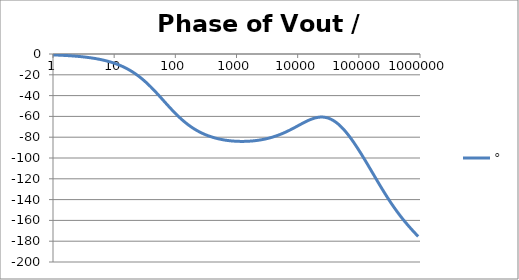
| Category | ° |
|---|---|
| 1.0 | -0.89 |
| 1.0715193052376064 | -0.954 |
| 1.1481536214968828 | -1.022 |
| 1.2302687708123814 | -1.095 |
| 1.318256738556407 | -1.174 |
| 1.4125375446227544 | -1.258 |
| 1.513561248436208 | -1.348 |
| 1.6218100973589298 | -1.444 |
| 1.7378008287493754 | -1.547 |
| 1.8620871366628673 | -1.658 |
| 1.9952623149688797 | -1.776 |
| 2.1379620895022318 | -1.903 |
| 2.2908676527677727 | -2.039 |
| 2.45470891568503 | -2.185 |
| 2.6302679918953817 | -2.341 |
| 2.8183829312644537 | -2.508 |
| 3.0199517204020156 | -2.687 |
| 3.235936569296282 | -2.879 |
| 3.467368504525316 | -3.085 |
| 3.7153522909717256 | -3.305 |
| 3.9810717055349727 | -3.541 |
| 4.265795188015926 | -3.793 |
| 4.570881896148749 | -4.064 |
| 4.897788193684462 | -4.353 |
| 5.2480746024977245 | -4.663 |
| 5.62341325190349 | -4.995 |
| 6.025595860743575 | -5.35 |
| 6.456542290346554 | -5.73 |
| 6.918309709189363 | -6.137 |
| 7.4131024130091765 | -6.572 |
| 7.943282347242814 | -7.038 |
| 8.511380382023765 | -7.536 |
| 9.120108393559095 | -8.068 |
| 9.772372209558105 | -8.636 |
| 10.47128548050899 | -9.243 |
| 11.22018454301963 | -9.892 |
| 12.022644346174127 | -10.584 |
| 12.88249551693134 | -11.321 |
| 13.803842646028851 | -12.108 |
| 14.791083881682074 | -12.945 |
| 15.848931924611136 | -13.836 |
| 16.98243652461744 | -14.784 |
| 18.197008586099834 | -15.789 |
| 19.498445997580447 | -16.856 |
| 20.892961308540382 | -17.986 |
| 22.387211385683386 | -19.18 |
| 23.988329190194897 | -20.441 |
| 25.703957827688622 | -21.769 |
| 27.54228703338165 | -23.165 |
| 29.51209226666385 | -24.629 |
| 31.62277660168379 | -26.16 |
| 33.884415613920254 | -27.756 |
| 36.307805477010106 | -29.416 |
| 38.90451449942804 | -31.136 |
| 41.686938347033525 | -32.911 |
| 44.6683592150963 | -34.736 |
| 47.86300923226381 | -36.605 |
| 51.28613839913647 | -38.511 |
| 54.95408738576247 | -40.446 |
| 58.88436553555889 | -42.401 |
| 63.09573444801931 | -44.366 |
| 67.60829753919813 | -46.334 |
| 72.44359600749901 | -48.293 |
| 77.62471166286915 | -50.235 |
| 83.17637711026705 | -52.151 |
| 89.12509381337456 | -54.033 |
| 95.49925860214357 | -55.872 |
| 102.32929922807544 | -57.663 |
| 109.64781961431841 | -59.399 |
| 117.48975549395293 | -61.075 |
| 125.89254117941665 | -62.688 |
| 134.89628825916537 | -64.235 |
| 144.54397707459273 | -65.713 |
| 154.88166189124806 | -67.122 |
| 165.95869074375608 | -68.46 |
| 177.82794100389225 | -69.729 |
| 190.5460717963248 | -70.928 |
| 204.17379446695278 | -72.059 |
| 218.77616239495524 | -73.124 |
| 234.42288153199212 | -74.124 |
| 251.18864315095806 | -75.062 |
| 269.15348039269156 | -75.939 |
| 288.4031503126605 | -76.758 |
| 309.0295432513591 | -77.521 |
| 331.1311214825911 | -78.231 |
| 354.81338923357566 | -78.89 |
| 380.18939632056095 | -79.499 |
| 407.3802778041123 | -80.062 |
| 436.5158322401654 | -80.58 |
| 467.7351412871979 | -81.056 |
| 501.18723362727184 | -81.49 |
| 537.0317963702526 | -81.886 |
| 575.4399373371566 | -82.244 |
| 616.5950018614822 | -82.565 |
| 660.6934480075952 | -82.853 |
| 707.9457843841375 | -83.107 |
| 758.5775750291831 | -83.328 |
| 812.8305161640983 | -83.519 |
| 870.9635899560801 | -83.678 |
| 933.2543007969903 | -83.808 |
| 999.9999999999998 | -83.909 |
| 1071.5193052376057 | -83.981 |
| 1148.1536214968828 | -84.025 |
| 1230.2687708123801 | -84.041 |
| 1318.2567385564053 | -84.028 |
| 1412.537544622753 | -83.988 |
| 1513.5612484362066 | -83.919 |
| 1621.8100973589292 | -83.823 |
| 1737.8008287493742 | -83.697 |
| 1862.0871366628671 | -83.542 |
| 1995.2623149688786 | -83.358 |
| 2137.9620895022326 | -83.143 |
| 2290.867652767771 | -82.897 |
| 2454.708915685027 | -82.62 |
| 2630.26799189538 | -82.31 |
| 2818.382931264451 | -81.966 |
| 3019.9517204020176 | -81.587 |
| 3235.9365692962774 | -81.173 |
| 3467.368504525316 | -80.723 |
| 3715.352290971724 | -80.235 |
| 3981.07170553497 | -79.709 |
| 4265.795188015923 | -79.144 |
| 4570.881896148745 | -78.539 |
| 4897.788193684463 | -77.894 |
| 5248.074602497726 | -77.209 |
| 5623.413251903489 | -76.485 |
| 6025.595860743574 | -75.721 |
| 6456.54229034655 | -74.92 |
| 6918.309709189357 | -74.084 |
| 7413.102413009165 | -73.214 |
| 7943.282347242815 | -72.316 |
| 8511.380382023763 | -71.392 |
| 9120.108393559092 | -70.449 |
| 9772.3722095581 | -69.493 |
| 10471.285480509003 | -68.533 |
| 11220.184543019639 | -67.576 |
| 12022.64434617411 | -66.633 |
| 12882.495516931338 | -65.715 |
| 13803.842646028841 | -64.834 |
| 14791.083881682063 | -64.001 |
| 15848.931924611119 | -63.231 |
| 16982.436524617453 | -62.536 |
| 18197.008586099837 | -61.93 |
| 19498.445997580417 | -61.426 |
| 20892.961308540387 | -61.037 |
| 22387.211385683382 | -60.773 |
| 23988.32919019488 | -60.646 |
| 25703.957827688606 | -60.666 |
| 27542.28703338167 | -60.84 |
| 29512.092266663854 | -61.175 |
| 31622.77660168378 | -61.677 |
| 33884.41561392023 | -62.348 |
| 36307.805477010166 | -63.191 |
| 38904.514499428085 | -64.205 |
| 41686.93834703348 | -65.39 |
| 44668.35921509631 | -66.741 |
| 47863.00923226382 | -68.254 |
| 51286.13839913646 | -69.924 |
| 54954.08738576241 | -71.744 |
| 58884.365535558936 | -73.705 |
| 63095.73444801934 | -75.799 |
| 67608.29753919817 | -78.016 |
| 72443.59600749899 | -80.347 |
| 77624.71166286913 | -82.783 |
| 83176.37711026703 | -85.313 |
| 89125.09381337445 | -87.928 |
| 95499.25860214363 | -90.62 |
| 102329.29922807543 | -93.378 |
| 109647.81961431848 | -96.195 |
| 117489.75549395289 | -99.061 |
| 125892.54117941685 | -101.97 |
| 134896.28825916522 | -104.913 |
| 144543.97707459255 | -107.882 |
| 154881.66189124787 | -110.87 |
| 165958.69074375575 | -113.867 |
| 177827.9410038922 | -116.867 |
| 190546.07179632425 | -119.861 |
| 204173.79446695274 | -122.841 |
| 218776.16239495497 | -125.798 |
| 234422.88153199226 | -128.725 |
| 251188.64315095753 | -131.614 |
| 269153.480392691 | -134.459 |
| 288403.15031266044 | -137.253 |
| 309029.5432513582 | -139.991 |
| 331131.1214825907 | -142.667 |
| 354813.3892335749 | -145.28 |
| 380189.3963205612 | -147.825 |
| 407380.2778041119 | -150.302 |
| 436515.8322401649 | -152.711 |
| 467735.14128719777 | -155.052 |
| 501187.2336272717 | -157.327 |
| 537031.7963702519 | -159.537 |
| 575439.9373371559 | -161.687 |
| 616595.001861482 | -163.781 |
| 660693.4480075944 | -165.822 |
| 707945.7843841374 | -167.815 |
| 758577.575029183 | -169.767 |
| 812830.5161640996 | -171.682 |
| 870963.5899560791 | -173.566 |
| 933254.3007969892 | -175.425 |